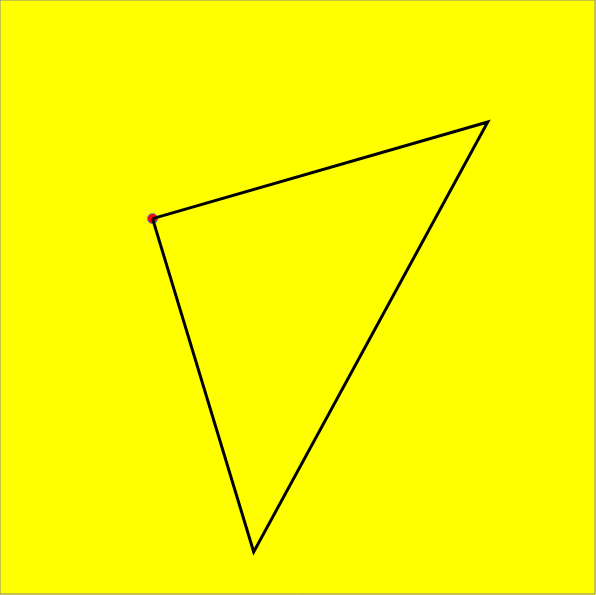
| Category | Series 0 |
|---|---|
| -5.13923773151656 | 2.793 |
| 6.704680424596144 | 6.213 |
| -1.5654426930795813 | -9.006 |
| -5.13923773151656 | 2.793 |